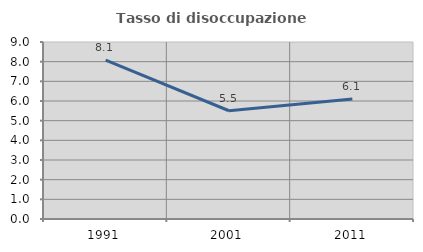
| Category | Tasso di disoccupazione giovanile  |
|---|---|
| 1991.0 | 8.075 |
| 2001.0 | 5.505 |
| 2011.0 | 6.098 |